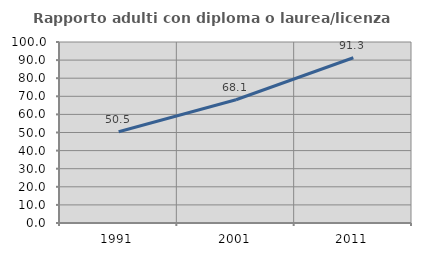
| Category | Rapporto adulti con diploma o laurea/licenza media  |
|---|---|
| 1991.0 | 50.454 |
| 2001.0 | 68.094 |
| 2011.0 | 91.316 |